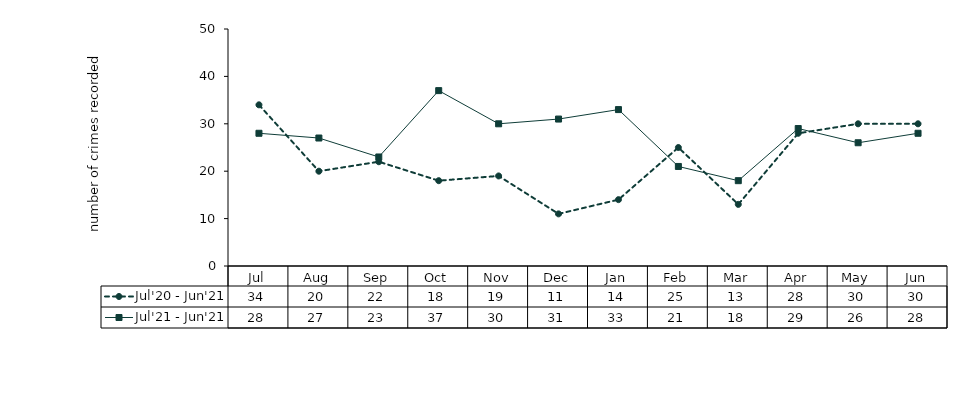
| Category | Jul'20 - Jun'21 | Jul'21 - Jun'21 |
|---|---|---|
| Jul | 34 | 28 |
| Aug | 20 | 27 |
| Sep | 22 | 23 |
| Oct | 18 | 37 |
| Nov | 19 | 30 |
| Dec | 11 | 31 |
| Jan | 14 | 33 |
| Feb | 25 | 21 |
| Mar | 13 | 18 |
| Apr | 28 | 29 |
| May | 30 | 26 |
| Jun | 30 | 28 |